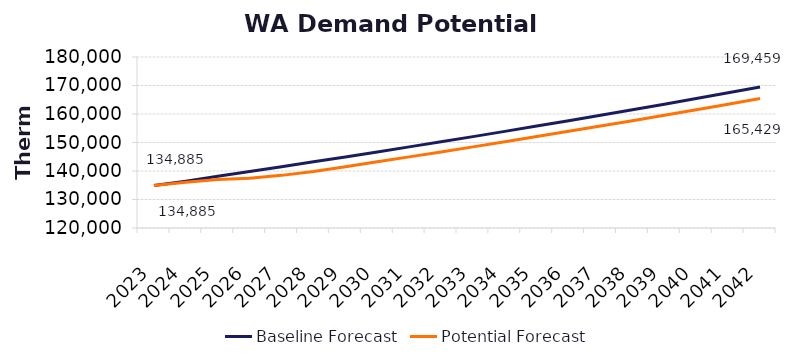
| Category | Baseline Forecast | Potential Forecast |
|---|---|---|
| 2023.0 | 134884.845 | 134884.845 |
| 2024.0 | 136430.892 | 136042.131 |
| 2025.0 | 138121.843 | 137039.037 |
| 2026.0 | 139818.427 | 137434.814 |
| 2027.0 | 141504.051 | 138468.643 |
| 2028.0 | 143210.63 | 139847.299 |
| 2029.0 | 144938.433 | 141525.066 |
| 2030.0 | 146687.73 | 143223.512 |
| 2031.0 | 148458.796 | 144950.685 |
| 2032.0 | 150251.909 | 146699.335 |
| 2033.0 | 152067.35 | 148469.736 |
| 2034.0 | 153905.405 | 150262.165 |
| 2035.0 | 155766.363 | 152076.905 |
| 2036.0 | 157650.517 | 153914.239 |
| 2037.0 | 159558.162 | 155774.458 |
| 2038.0 | 161489.601 | 157657.852 |
| 2039.0 | 163445.136 | 159564.72 |
| 2040.0 | 165425.078 | 161495.36 |
| 2041.0 | 167429.737 | 163450.077 |
| 2042.0 | 169459.431 | 165429.178 |